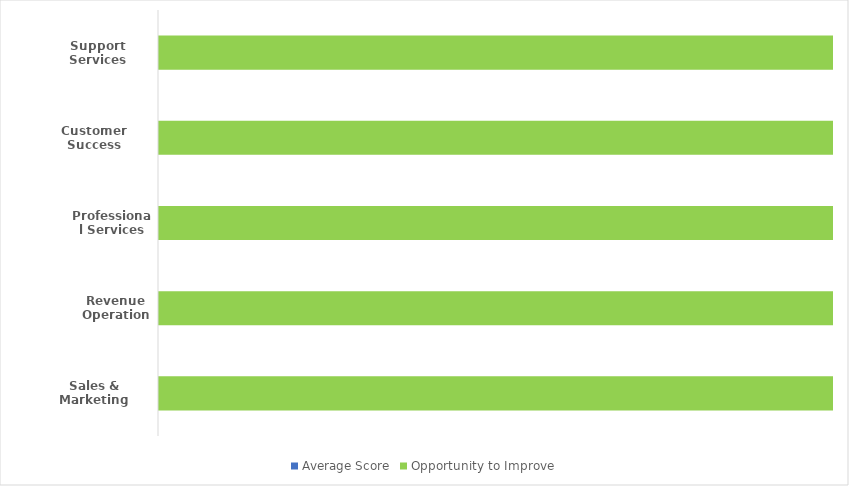
| Category | Average Score | Opportunity to Improve |
|---|---|---|
| Sales & Marketing | 0 | 4 |
| Revenue Operations | 0 | 4 |
| Professional Services | 0 | 4 |
| Customer Success | 0 | 4 |
| Support Services | 0 | 4 |